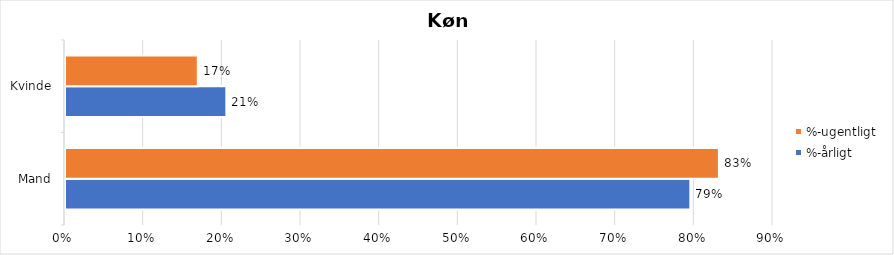
| Category | %-årligt | %-ugentligt |
|---|---|---|
| Mand | 0.795 | 0.831 |
| Kvinde | 0.205 | 0.169 |